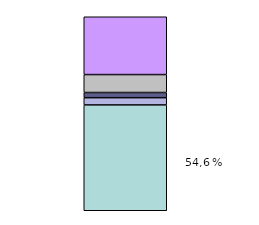
| Category | Series 0 | Series 1 | Series 2 | Series 3 | Series 4 |
|---|---|---|---|---|---|
| 0 | 165711.398 | 11345.4 | 8092.288 | 28080.951 | 90546.571 |